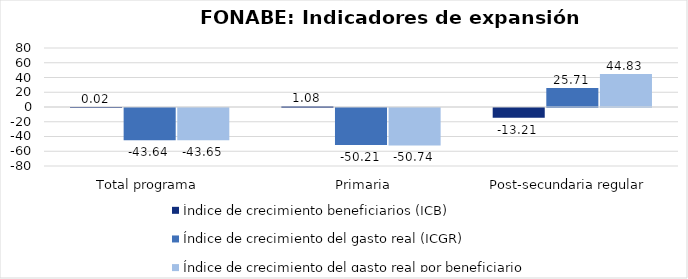
| Category | Índice de crecimiento beneficiarios (ICB)  | Índice de crecimiento del gasto real (ICGR)  | Índice de crecimiento del gasto real por beneficiario (ICGRB)  |
|---|---|---|---|
| Total programa | 0.019 | -43.639 | -43.65 |
|   Primaria | 1.076 | -50.206 | -50.736 |
| Post-secundaria regular  | -13.205 | 25.706 | 44.831 |